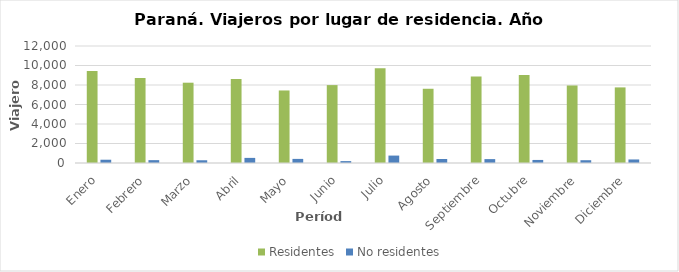
| Category | Residentes | No residentes |
|---|---|---|
| Enero | 9448 | 336 |
| Febrero | 8721 | 293 |
| Marzo | 8236 | 281 |
| Abril | 8614 | 524 |
| Mayo | 7439 | 421 |
| Junio | 7990 | 195 |
| Julio | 9723 | 761 |
| Agosto | 7614 | 409 |
| Septiembre | 8884 | 399 |
| Octubre | 9016 | 313 |
| Noviembre | 7951 | 285 |
| Diciembre | 7754 | 363 |